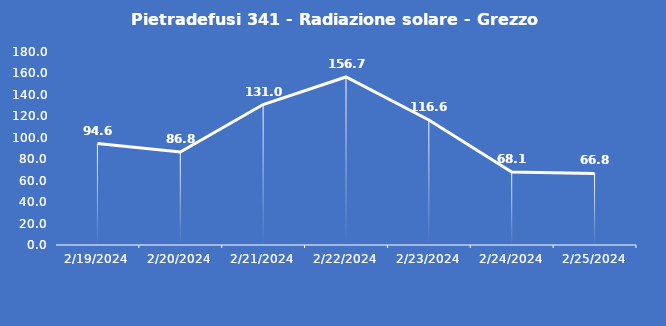
| Category | Pietradefusi 341 - Radiazione solare - Grezzo (W/m2) |
|---|---|
| 2/19/24 | 94.6 |
| 2/20/24 | 86.8 |
| 2/21/24 | 131 |
| 2/22/24 | 156.7 |
| 2/23/24 | 116.6 |
| 2/24/24 | 68.1 |
| 2/25/24 | 66.8 |